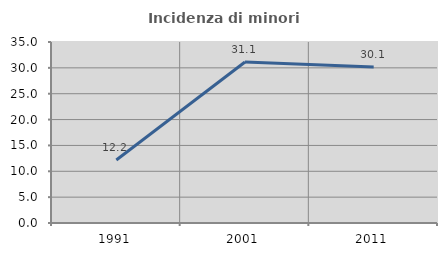
| Category | Incidenza di minori stranieri |
|---|---|
| 1991.0 | 12.195 |
| 2001.0 | 31.124 |
| 2011.0 | 30.148 |